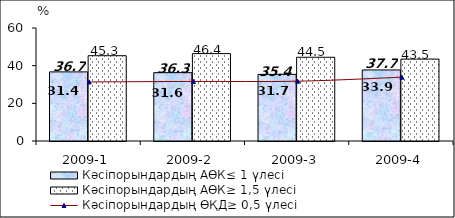
| Category | Кәсіпорындардың АӨК≤ 1 үлесі | Кәсіпорындардың АӨК≥ 1,5 үлесі |
|---|---|---|
| 2009-1 | 36.702 | 45.282 |
| 2009-2 | 36.293 | 46.397 |
| 2009-3 | 35.38 | 44.464 |
| 2009-4 | 37.731 | 43.494 |